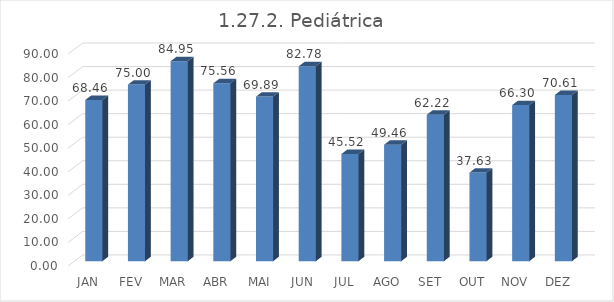
| Category | 1.27.2. Pediátrica  |
|---|---|
|  JAN  | 68.459 |
|  FEV  | 75 |
|  MAR  | 84.946 |
|  ABR  | 75.556 |
|  MAI  | 69.892 |
|  JUN  | 82.778 |
|  JUL  | 45.52 |
|  AGO  | 49.462 |
|  SET  | 62.222 |
|  OUT  | 37.634 |
|  NOV  | 66.296 |
|  DEZ  | 70.609 |